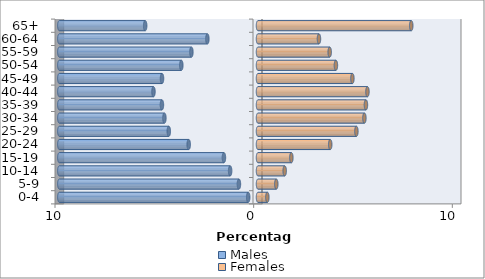
| Category | Males | Females |
|---|---|---|
| 0-4 | -0.493 | 0.471 |
| 5-9 | -0.961 | 0.92 |
| 10-14 | -1.403 | 1.343 |
| 15-19 | -1.715 | 1.679 |
| 20-24 | -3.488 | 3.635 |
| 25-29 | -4.491 | 4.953 |
| 30-34 | -4.712 | 5.356 |
| 35-39 | -4.837 | 5.433 |
| 40-44 | -5.262 | 5.509 |
| 45-49 | -4.832 | 4.752 |
| 50-54 | -3.861 | 3.922 |
| 55-59 | -3.353 | 3.609 |
| 60-64 | -2.549 | 3.068 |
| 65+ | -5.679 | 7.714 |